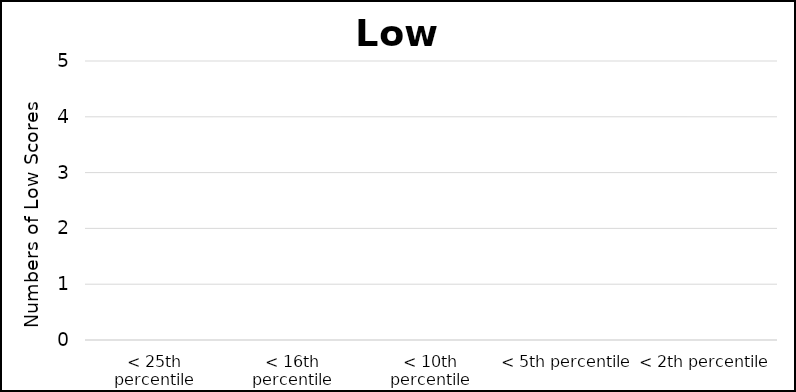
| Category | Series 0 |
|---|---|
| < 25th percentile | 0 |
| < 16th percentile | 0 |
| < 10th percentile | 0 |
| < 5th percentile | 0 |
| < 2th percentile | 0 |